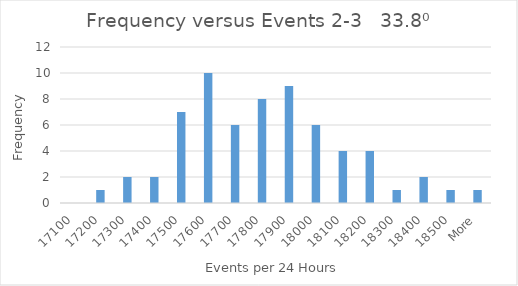
| Category | Series 0 |
|---|---|
| 17100 | 0 |
| 17200 | 1 |
| 17300 | 2 |
| 17400 | 2 |
| 17500 | 7 |
| 17600 | 10 |
| 17700 | 6 |
| 17800 | 8 |
| 17900 | 9 |
| 18000 | 6 |
| 18100 | 4 |
| 18200 | 4 |
| 18300 | 1 |
| 18400 | 2 |
| 18500 | 1 |
| More | 1 |